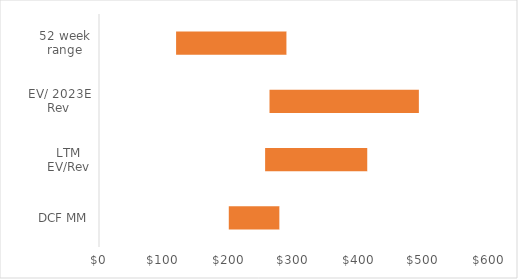
| Category | Series 0 | Series 1 | Series 2 |
|---|---|---|---|
| DCF MM | 199.67 | 78.17 | 277.84 |
| LTM EV/Rev | 255.57 | 157.49 | 413.06 |
| EV/ 2023E Rev | 262.32 | 229.88 | 492.2 |
| 52 week range | 118.6 | 170.1 | 305.6 |